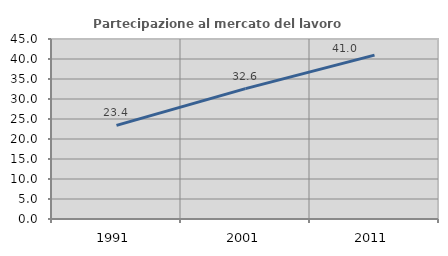
| Category | Partecipazione al mercato del lavoro  femminile |
|---|---|
| 1991.0 | 23.401 |
| 2001.0 | 32.586 |
| 2011.0 | 40.972 |